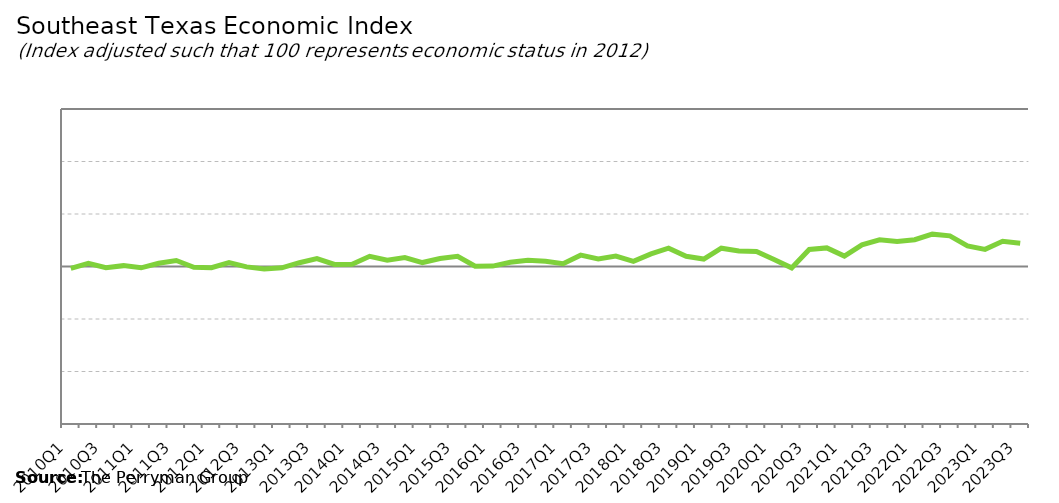
| Category | Composite Index |
|---|---|
| 2010Q1 | 99.307 |
| 2010Q2 | 101.24 |
| 2010Q3 | 99.55 |
| 2010Q4 | 100.327 |
| 2011Q1 | 99.495 |
| 2011Q2 | 101.243 |
| 2011Q3 | 102.301 |
| 2011Q4 | 99.729 |
| 2012Q1 | 99.557 |
| 2012Q2 | 101.522 |
| 2012Q3 | 99.851 |
| 2012Q4 | 99.071 |
| 2013Q1 | 99.497 |
| 2013Q2 | 101.44 |
| 2013Q3 | 102.995 |
| 2013Q4 | 100.781 |
| 2014Q1 | 100.872 |
| 2014Q2 | 103.9 |
| 2014Q3 | 102.402 |
| 2014Q4 | 103.379 |
| 2015Q1 | 101.505 |
| 2015Q2 | 103.02 |
| 2015Q3 | 103.915 |
| 2015Q4 | 100.089 |
| 2016Q1 | 100.148 |
| 2016Q2 | 101.624 |
| 2016Q3 | 102.386 |
| 2016Q4 | 102.004 |
| 2017Q1 | 101.09 |
| 2017Q2 | 104.33 |
| 2017Q3 | 102.904 |
| 2017Q4 | 103.968 |
| 2018Q1 | 101.979 |
| 2018Q2 | 104.82 |
| 2018Q3 | 106.981 |
| 2018Q4 | 103.907 |
| 2019Q1 | 102.848 |
| 2019Q2 | 106.961 |
| 2019Q3 | 105.889 |
| 2019Q4 | 105.759 |
| 2020Q1 | 102.64 |
| 2020Q2 | 99.475 |
| 2020Q3 | 106.476 |
| 2020Q4 | 107.084 |
| 2021Q1 | 103.979 |
| 2021Q2 | 108.255 |
| 2021Q3 | 110.186 |
| 2021Q4 | 109.505 |
| 2022Q1 | 110.219 |
| 2022Q2 | 112.32 |
| 2022Q3 | 111.666 |
| 2022Q4 | 107.811 |
| 2023Q1 | 106.531 |
| 2023Q2 | 109.591 |
| 2023Q3 | 108.817 |